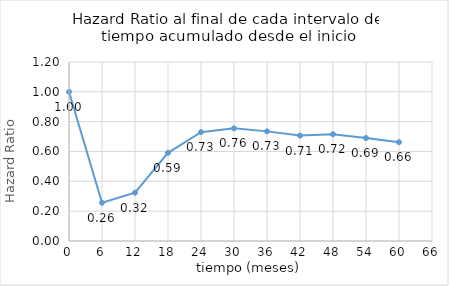
| Category | HRi |
|---|---|
| 0.0 | 1 |
| 6.0 | 0.257 |
| 12.0 | 0.324 |
| 18.0 | 0.591 |
| 24.0 | 0.73 |
| 30.0 | 0.755 |
| 36.0 | 0.735 |
| 42.0 | 0.707 |
| 48.0 | 0.716 |
| 54.0 | 0.69 |
| 60.0 | 0.663 |